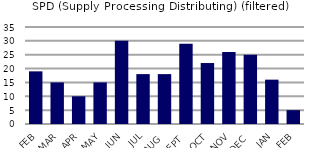
| Category | SPD (Supply Processing Distributing) (filtered) |
|---|---|
| FEB | 19 |
| MAR | 15 |
| APR | 10 |
| MAY | 15 |
| JUN | 30 |
| JUL | 18 |
| AUG | 18 |
| SEPT | 29 |
| OCT | 22 |
| NOV | 26 |
| DEC | 25 |
| JAN | 16 |
| FEB | 5 |